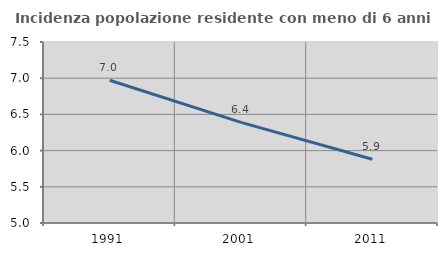
| Category | Incidenza popolazione residente con meno di 6 anni |
|---|---|
| 1991.0 | 6.972 |
| 2001.0 | 6.39 |
| 2011.0 | 5.881 |